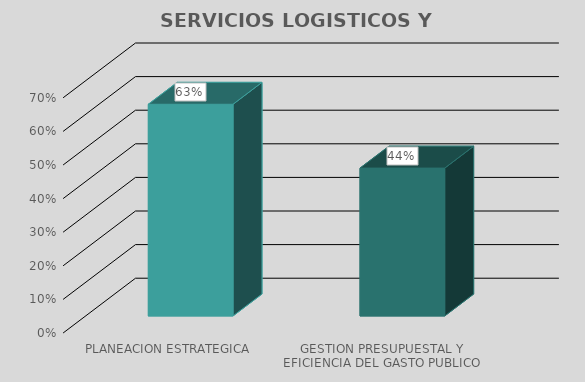
| Category | Series 0 |
|---|---|
| PLANEACION ESTRATEGICA | 0.63 |
| GESTION PRESUPUESTAL Y EFICIENCIA DEL GASTO PUBLICO | 0.44 |